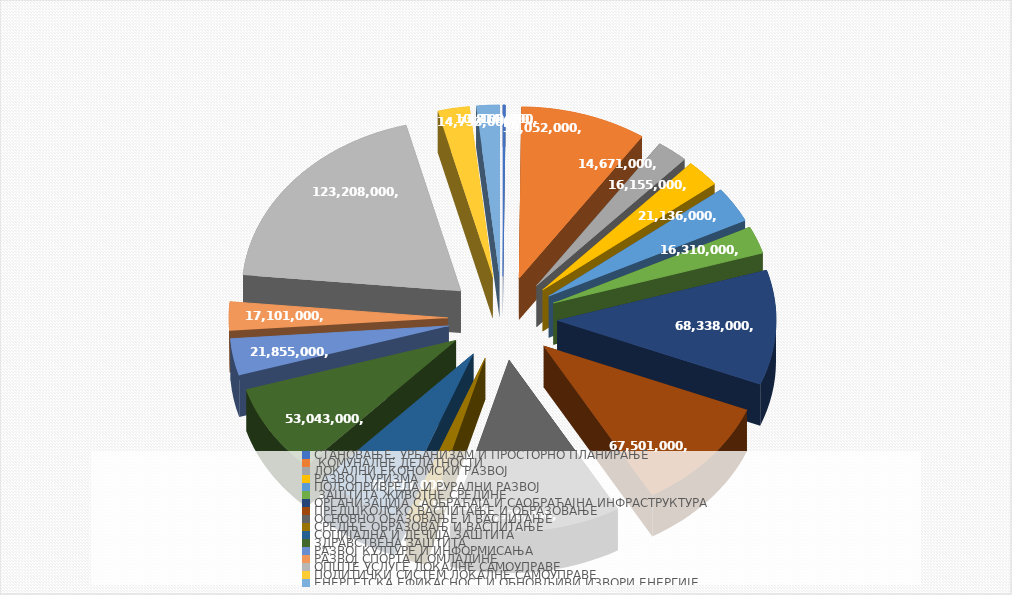
| Category | Series 0 |
|---|---|
| СТАНОВАЊЕ, УРБАНИЗАМ И ПРОСТОРНО ПЛАНИРАЊЕ | 1109000 |
|  КОМУНАЛНЕ ДЕЛАТНОСТИ  | 59052000 |
| ЛОКАЛНИ ЕКОНОМСКИ РАЗВОЈ  | 14671000 |
| РАЗВОЈ ТУРИЗМА | 16155000 |
| ПОЉОПРИВРЕДА И РУРАЛНИ РАЗВОЈ | 21136000 |
|  ЗАШТИТА ЖИВОТНЕ СРЕДИНЕ | 16310000 |
| ОРГАНИЗАЦИЈА САОБРАЋАЈА И САОБРАЋАЈНА ИНФРАСТРУКТУРА | 68338000 |
| ПРЕДШКОЛСКО ВАСПИТАЊЕ И ОБРАЗОВАЊЕ | 67501000 |
| ОСНОВНО ОБАЗОВАЊЕ И ВАСПИТАЊЕ | 79920000 |
| СРЕДЊЕ ОБРАЗОВАЊ И ВАСПИТАЊЕ | 9575000 |
| СОЦИЈАЛНА И ДЕЧИЈА ЗАШТИТА  | 38611000 |
| ЗДРАВСТВЕНА ЗАШТИТА | 53043000 |
| РАЗВОЈ КУЛТУРЕ И ИНФОРМИСАЊА | 21855000 |
| РАЗВОЈ СПОРТА И ОМЛАДИНЕ | 17101000 |
| ОПШТЕ УСЛУГЕ ЛОКАЛНЕ САМОУПРАВЕ | 123208000 |
| ПОЛИТИЧКИ СИСТЕМ ЛОКАЛНЕ САМОУПРАВЕ | 14733000 |
| ЕНЕРГЕТСКА ЕФИКАСНОСТ И ОБНОВЉИВИ ИЗВОРИ ЕНЕРГИЈЕ | 10814000 |